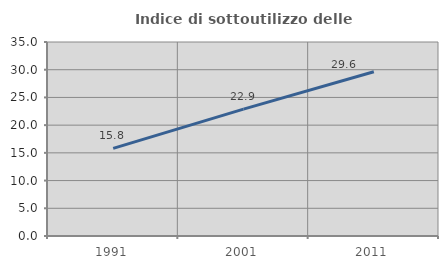
| Category | Indice di sottoutilizzo delle abitazioni  |
|---|---|
| 1991.0 | 15.803 |
| 2001.0 | 22.889 |
| 2011.0 | 29.629 |